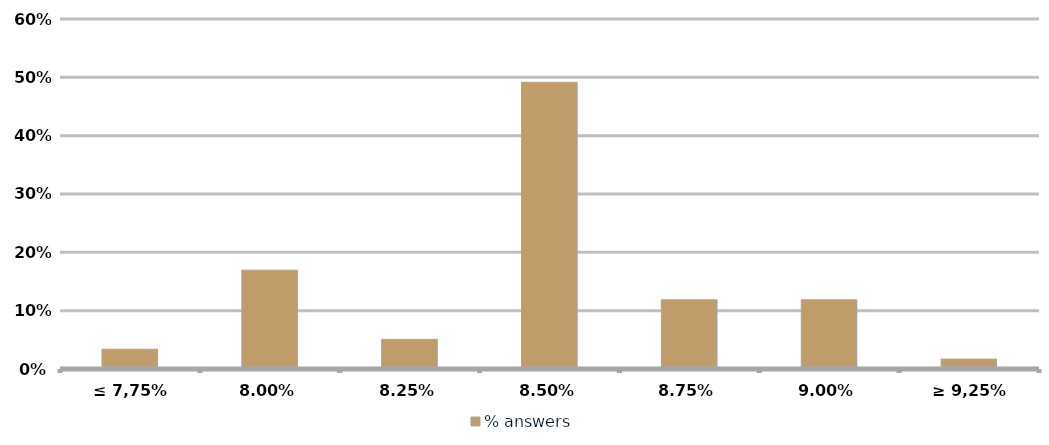
| Category | % answers |
|---|---|
| ≤ 7,75% | 0.034 |
| 8,00% | 0.169 |
| 8,25% | 0.051 |
| 8,50% | 0.492 |
| 8,75% | 0.119 |
| 9,00% | 0.119 |
| ≥ 9,25% | 0.017 |